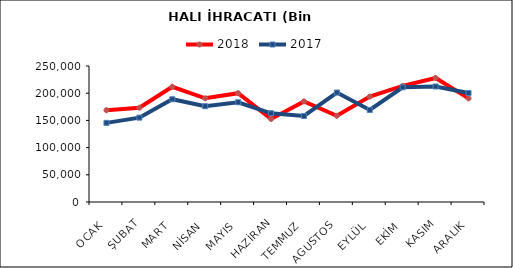
| Category | 2018 | 2017 |
|---|---|---|
| OCAK | 168765.861 | 145475.118 |
| ŞUBAT | 173337.792 | 155080.076 |
| MART | 211790.018 | 188918.923 |
| NİSAN | 190638.385 | 176038.903 |
| MAYIS | 200048.18 | 183391.486 |
| HAZİRAN | 152699.57 | 163098.799 |
| TEMMUZ | 184959.298 | 158118.469 |
| AGUSTOS | 158522.322 | 201227.195 |
| EYLÜL | 193708.736 | 169207.314 |
| EKİM | 213498.54 | 210889.31 |
| KASIM | 227931.805 | 212318.308 |
| ARALIK | 190400.57 | 200297.653 |